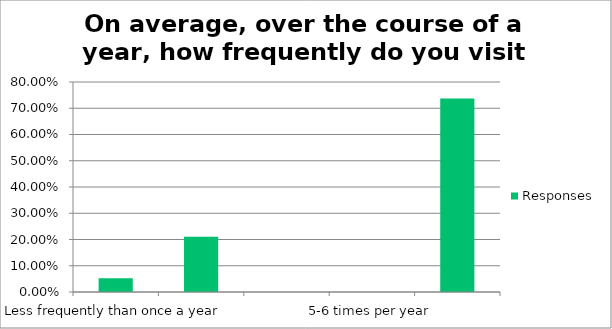
| Category | Responses |
|---|---|
| Less frequently than once a year | 0.053 |
| 1-2 times per year | 0.21 |
| 3-4 times per year | 0 |
| 5-6 times per year | 0 |
| More frequently than six times a year | 0.737 |